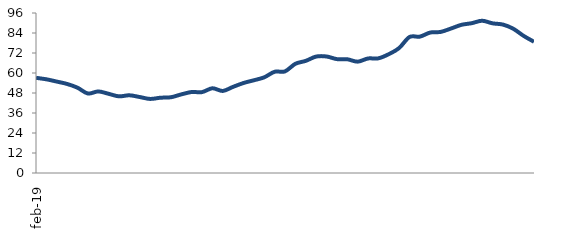
| Category | Series 0 |
|---|---|
| 2019-02-01 | 57.103 |
| 2019-03-01 | 56.217 |
| 2019-04-01 | 54.855 |
| 2019-05-01 | 53.426 |
| 2019-06-01 | 51.167 |
| 2019-07-01 | 47.705 |
| 2019-08-01 | 48.94 |
| 2019-09-01 | 47.515 |
| 2019-10-01 | 45.989 |
| 2019-11-01 | 46.631 |
| 2019-12-01 | 45.576 |
| 2020-01-01 | 44.444 |
| 2020-02-01 | 45.166 |
| 2020-03-01 | 45.444 |
| 2020-04-01 | 47.162 |
| 2020-05-01 | 48.595 |
| 2020-06-01 | 48.53 |
| 2020-07-01 | 50.83 |
| 2020-08-01 | 49.231 |
| 2020-09-01 | 51.699 |
| 2020-10-01 | 53.991 |
| 2020-11-01 | 55.639 |
| 2020-12-01 | 57.413 |
| 2021-01-01 | 60.742 |
| 2021-02-01 | 60.984 |
| 2021-03-01 | 65.524 |
| 2021-04-01 | 67.28 |
| 2021-05-01 | 69.863 |
| 2021-06-01 | 69.912 |
| 2021-07-01 | 68.331 |
| 2021-08-01 | 68.248 |
| 2021-09-01 | 66.807 |
| 2021-10-01 | 68.707 |
| 2021-11-01 | 68.802 |
| 2021-12-01 | 71.282 |
| 2022-01-01 | 74.964 |
| 2022-02-01 | 81.594 |
| 2022-03-01 | 81.823 |
| 2022-04-01 | 84.283 |
| 2022-05-01 | 84.65 |
| 2022-06-01 | 86.683 |
| 2022-07-01 | 88.894 |
| 2022-08-01 | 89.887 |
| 2022-09-01 | 91.356 |
| 2022-10-01 | 89.801 |
| 2022-11-01 | 89.064 |
| 2022-12-01 | 86.562 |
| 2023-01-01 | 82.272 |
| 2023-02-01 | 78.738 |